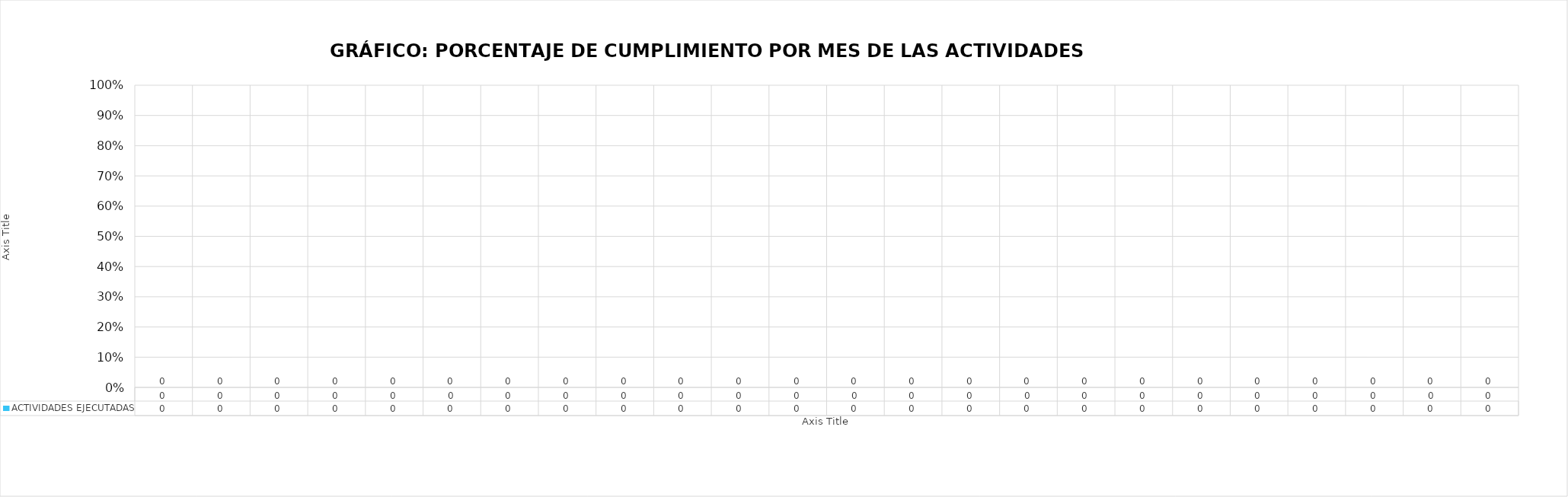
| Category | ACTIVIDADES EJECUTADAS |
|---|---|
| 0.0 | 0 |
| 0.0 | 0 |
| 0.0 | 0 |
| 0.0 | 0 |
| 0.0 | 0 |
| 0.0 | 0 |
| 0.0 | 0 |
| 0.0 | 0 |
| 0.0 | 0 |
| 0.0 | 0 |
| 0.0 | 0 |
| 0.0 | 0 |
| 0.0 | 0 |
| 0.0 | 0 |
| 0.0 | 0 |
| 0.0 | 0 |
| 0.0 | 0 |
| 0.0 | 0 |
| 0.0 | 0 |
| 0.0 | 0 |
| 0.0 | 0 |
| 0.0 | 0 |
| 0.0 | 0 |
| 0.0 | 0 |